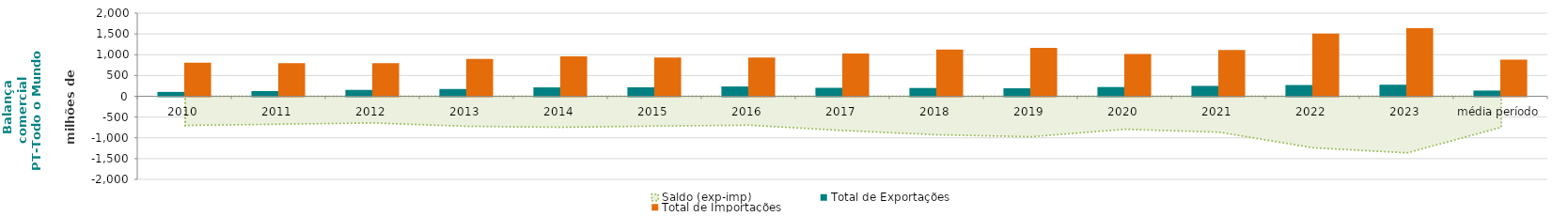
| Category | Total de Exportações  | Total de Importações  |
|---|---|---|
| 2010 | 104.812 | 808.095 |
| 2011 | 124.655 | 796.897 |
| 2012 | 153.084 | 794.759 |
| 2013 | 174.954 | 898.104 |
| 2014 | 213.66 | 959.857 |
| 2015 | 216.25 | 934.523 |
| 2016 | 235.586 | 931.359 |
| 2017 | 203.466 | 1027.78 |
| 2018 | 199.095 | 1125.824 |
| 2019 | 192.483 | 1165.965 |
| 2020 | 222.125 | 1015.898 |
| 2021 | 249.031 | 1113.812 |
| 2022 | 270.311 | 1510.492 |
| 2023 | 277.688 | 1639.489 |
| média período | 137.22 | 883.657 |